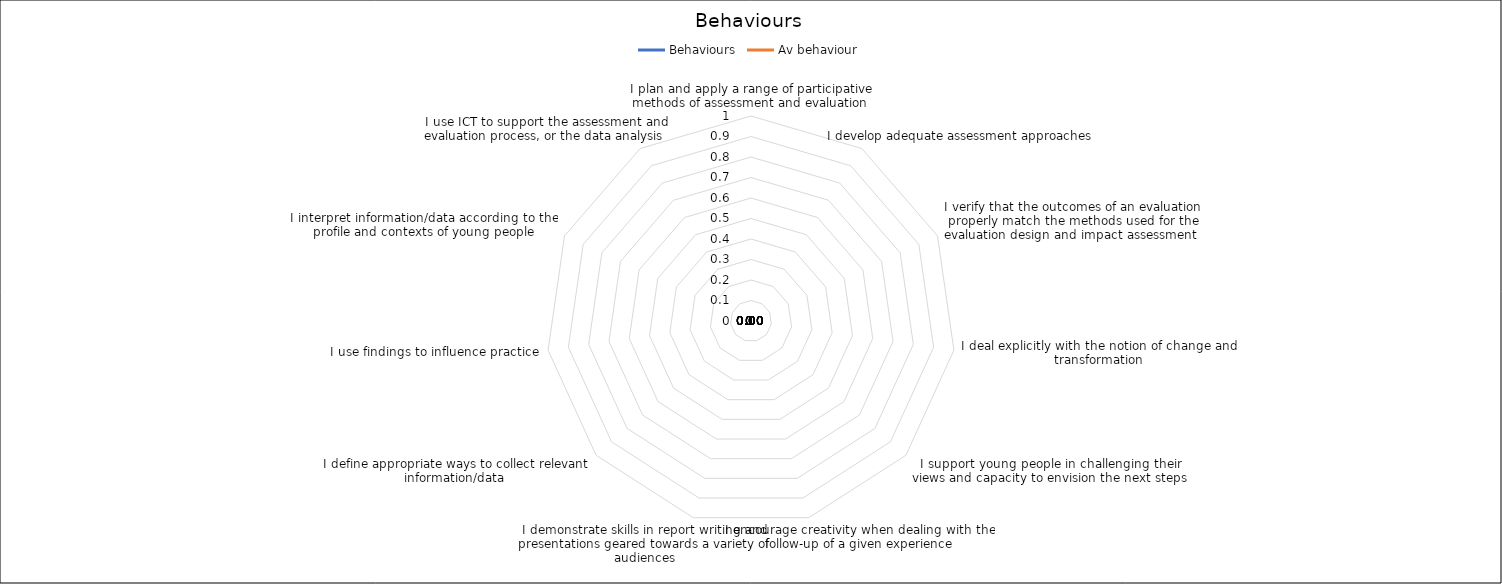
| Category | Behaviours | Av behaviour |
|---|---|---|
| I plan and apply a range of participative methods of assessment and evaluation | 0 | 0 |
| I develop adequate assessment approaches  | 0 | 0 |
| I verify that the outcomes of an evaluation properly match the methods used for the evaluation design and impact assessment  | 0 | 0 |
| I deal explicitly with the notion of change and transformation | 0 | 0 |
| I support young people in challenging their views and capacity to envision the next steps | 0 | 0 |
| I encourage creativity when dealing with the follow-up of a given experience | 0 | 0 |
| I demonstrate skills in report writing and presentations geared towards a variety of audiences | 0 | 0 |
| I define appropriate ways to collect relevant information/data  | 0 | 0 |
| I use findings to influence practice | 0 | 0 |
| I interpret information/data according to the profile and contexts of young people | 0 | 0 |
| I use ICT to support the assessment and evaluation process, or the data analysis  | 0 | 0 |